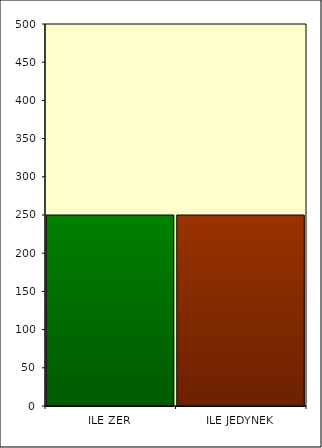
| Category | Series 0 |
|---|---|
| ILE ZER | 250 |
| ILE JEDYNEK | 250 |